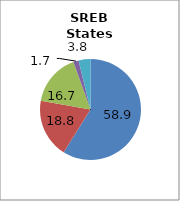
| Category | 50 states and D.C.2 |
|---|---|
| White | 58.926 |
| Black | 18.839 |
| Hispanic | 16.741 |
| Two or More Races | 1.692 |
| All Other1 | 3.803 |